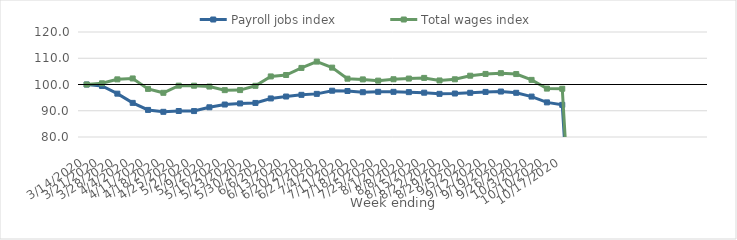
| Category | Payroll jobs index | Total wages index |
|---|---|---|
| 14/03/2020 | 100 | 100 |
| 21/03/2020 | 99.449 | 100.453 |
| 28/03/2020 | 96.51 | 101.96 |
| 04/04/2020 | 92.997 | 102.303 |
| 11/04/2020 | 90.316 | 98.322 |
| 18/04/2020 | 89.592 | 96.837 |
| 25/04/2020 | 89.901 | 99.557 |
| 02/05/2020 | 89.878 | 99.545 |
| 09/05/2020 | 91.319 | 99.216 |
| 16/05/2020 | 92.374 | 97.846 |
| 23/05/2020 | 92.78 | 97.874 |
| 30/05/2020 | 92.972 | 99.498 |
| 06/06/2020 | 94.687 | 103.076 |
| 13/06/2020 | 95.417 | 103.617 |
| 20/06/2020 | 96.065 | 106.318 |
| 27/06/2020 | 96.429 | 108.722 |
| 04/07/2020 | 97.631 | 106.427 |
| 11/07/2020 | 97.519 | 102.214 |
| 18/07/2020 | 97.064 | 101.941 |
| 25/07/2020 | 97.214 | 101.476 |
| 01/08/2020 | 97.205 | 102.001 |
| 08/08/2020 | 97.088 | 102.261 |
| 15/08/2020 | 96.877 | 102.514 |
| 22/08/2020 | 96.443 | 101.54 |
| 29/08/2020 | 96.565 | 101.988 |
| 05/09/2020 | 96.838 | 103.348 |
| 12/09/2020 | 97.177 | 104.028 |
| 19/09/2020 | 97.317 | 104.313 |
| 26/09/2020 | 96.835 | 103.981 |
| 03/10/2020 | 95.402 | 101.76 |
| 10/10/2020 | 93.187 | 98.44 |
| 17/10/2020 | 92.237 | 98.382 |